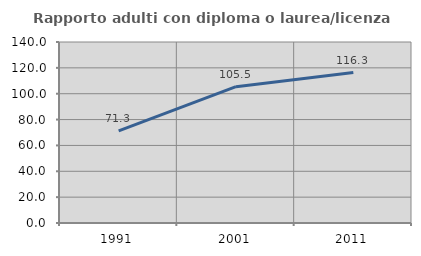
| Category | Rapporto adulti con diploma o laurea/licenza media  |
|---|---|
| 1991.0 | 71.324 |
| 2001.0 | 105.455 |
| 2011.0 | 116.327 |